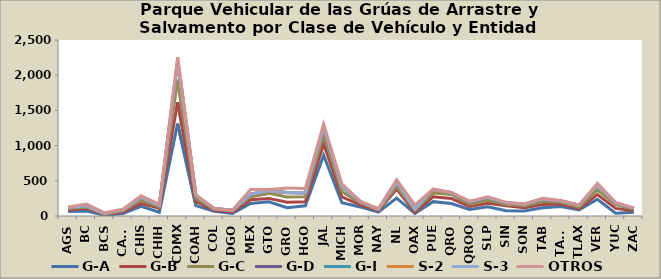
| Category | G-A | G-B | G-C | G-D | G-I | S-2 | S-3 | OTROS |
|---|---|---|---|---|---|---|---|---|
| AGS | 63 | 23 | 22 | 13 | 1 | 0 | 0 | 6 |
| BC | 71 | 38 | 17 | 18 | 0 | 1 | 0 | 24 |
| BCS | 12 | 8 | 7 | 4 | 1 | 0 | 0 | 14 |
| CAMP | 34 | 23 | 18 | 13 | 1 | 0 | 0 | 6 |
| CHIS | 136 | 41 | 46 | 42 | 0 | 0 | 0 | 24 |
| CHIH | 54 | 59 | 16 | 18 | 0 | 0 | 0 | 18 |
| CDMX | 1313 | 304 | 317 | 258 | 6 | 2 | 0 | 54 |
| COAH | 147 | 59 | 41 | 36 | 6 | 0 | 0 | 9 |
| COL | 66 | 16 | 12 | 10 | 0 | 1 | 0 | 5 |
| DGO | 36 | 19 | 21 | 4 | 0 | 0 | 0 | 2 |
| MEX | 178 | 54 | 40 | 37 | 3 | 0 | 0 | 65 |
| GTO | 201 | 49 | 71 | 37 | 1 | 0 | 0 | 17 |
| GRO | 118 | 79 | 72 | 63 | 1 | 0 | 0 | 64 |
| HGO | 144 | 59 | 69 | 56 | 1 | 0 | 0 | 63 |
| JAL | 862 | 164 | 122 | 105 | 5 | 2 | 0 | 45 |
| MICH | 189 | 83 | 75 | 66 | 0 | 3 | 0 | 42 |
| MOR | 129 | 29 | 28 | 19 | 1 | 0 | 0 | 7 |
| NAY | 57 | 21 | 13 | 8 | 0 | 0 | 0 | 2 |
| NL | 255 | 126 | 37 | 55 | 8 | 0 | 0 | 36 |
| OAX | 38 | 14 | 29 | 17 | 0 | 0 | 0 | 60 |
| PUE | 204 | 68 | 54 | 49 | 1 | 1 | 2 | 2 |
| QRO | 177 | 71 | 58 | 26 | 0 | 0 | 0 | 4 |
| QROO | 92 | 44 | 31 | 34 | 1 | 0 | 0 | 9 |
| SLP | 130 | 52 | 36 | 42 | 1 | 0 | 0 | 13 |
| SIN | 74 | 72 | 16 | 19 | 5 | 0 | 1 | 7 |
| SON | 72 | 47 | 28 | 21 | 0 | 0 | 0 | 3 |
| TAB | 118 | 45 | 42 | 37 | 0 | 0 | 0 | 11 |
| TAMS | 135 | 35 | 24 | 18 | 1 | 1 | 0 | 6 |
| TLAX | 87 | 18 | 22 | 25 | 0 | 0 | 0 | 3 |
| VER | 237 | 68 | 63 | 72 | 0 | 1 | 0 | 25 |
| YUC | 40 | 68 | 53 | 21 | 0 | 0 | 0 | 11 |
| ZAC | 52 | 23 | 21 | 14 | 0 | 2 | 0 | 4 |